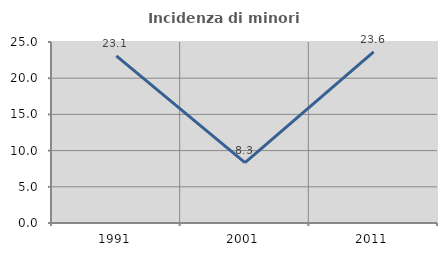
| Category | Incidenza di minori stranieri |
|---|---|
| 1991.0 | 23.077 |
| 2001.0 | 8.333 |
| 2011.0 | 23.622 |